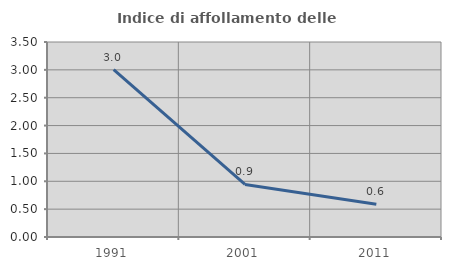
| Category | Indice di affollamento delle abitazioni  |
|---|---|
| 1991.0 | 3.005 |
| 2001.0 | 0.944 |
| 2011.0 | 0.588 |